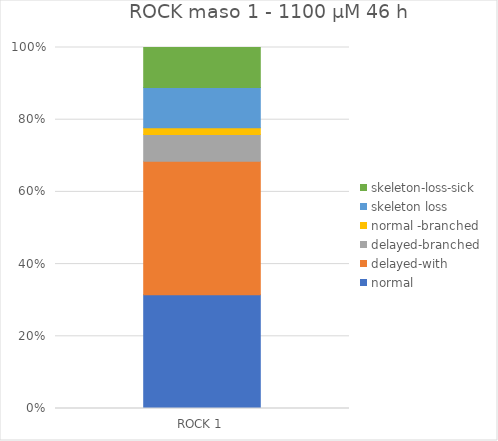
| Category | normal | delayed-with | delayed-branched | normal -branched | skeleton loss | skeleton-loss-sick |
|---|---|---|---|---|---|---|
| 0 | 17 | 20 | 4 | 1 | 6 | 6 |